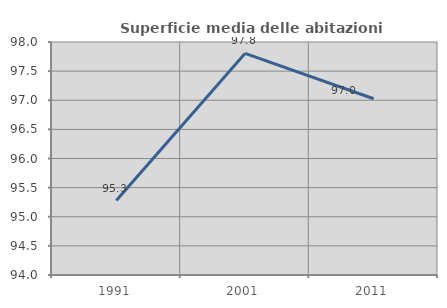
| Category | Superficie media delle abitazioni occupate |
|---|---|
| 1991.0 | 95.278 |
| 2001.0 | 97.804 |
| 2011.0 | 97.026 |